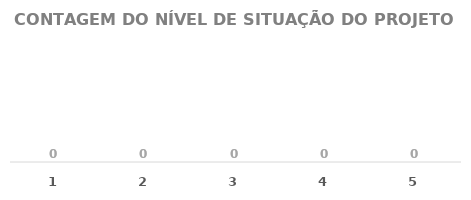
| Category | QTD. |
|---|---|
| 1.0 | 0 |
| 2.0 | 0 |
| 3.0 | 0 |
| 4.0 | 0 |
| 5.0 | 0 |